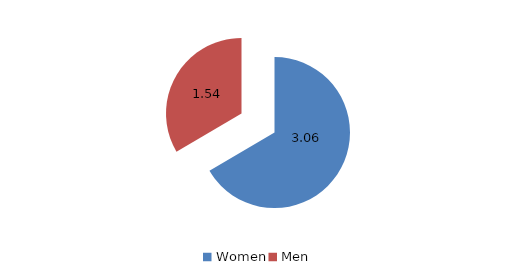
| Category | Series 0 |
|---|---|
| Women | 3.06 |
| Men | 1.54 |